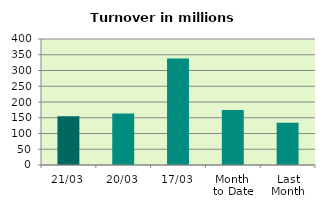
| Category | Series 0 |
|---|---|
| 21/03 | 154.605 |
| 20/03 | 163.459 |
| 17/03 | 338.24 |
| Month 
to Date | 174.24 |
| Last
Month | 133.846 |